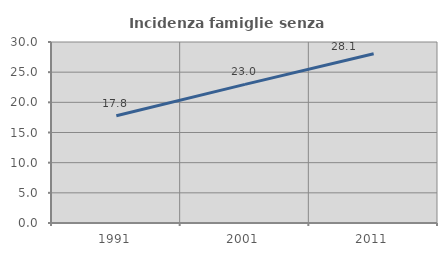
| Category | Incidenza famiglie senza nuclei |
|---|---|
| 1991.0 | 17.786 |
| 2001.0 | 22.977 |
| 2011.0 | 28.059 |